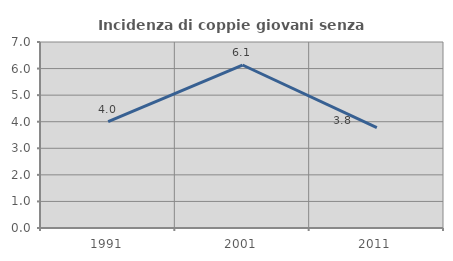
| Category | Incidenza di coppie giovani senza figli |
|---|---|
| 1991.0 | 4.004 |
| 2001.0 | 6.134 |
| 2011.0 | 3.777 |